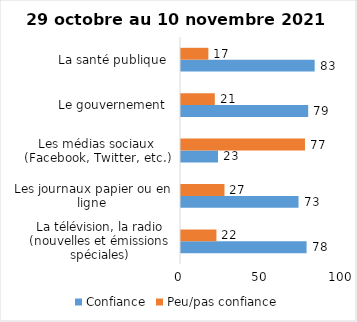
| Category | Confiance | Peu/pas confiance |
|---|---|---|
| La télévision, la radio (nouvelles et émissions spéciales) | 78 | 22 |
| Les journaux papier ou en ligne | 73 | 27 |
| Les médias sociaux (Facebook, Twitter, etc.) | 23 | 77 |
| Le gouvernement  | 79 | 21 |
| La santé publique  | 83 | 17 |